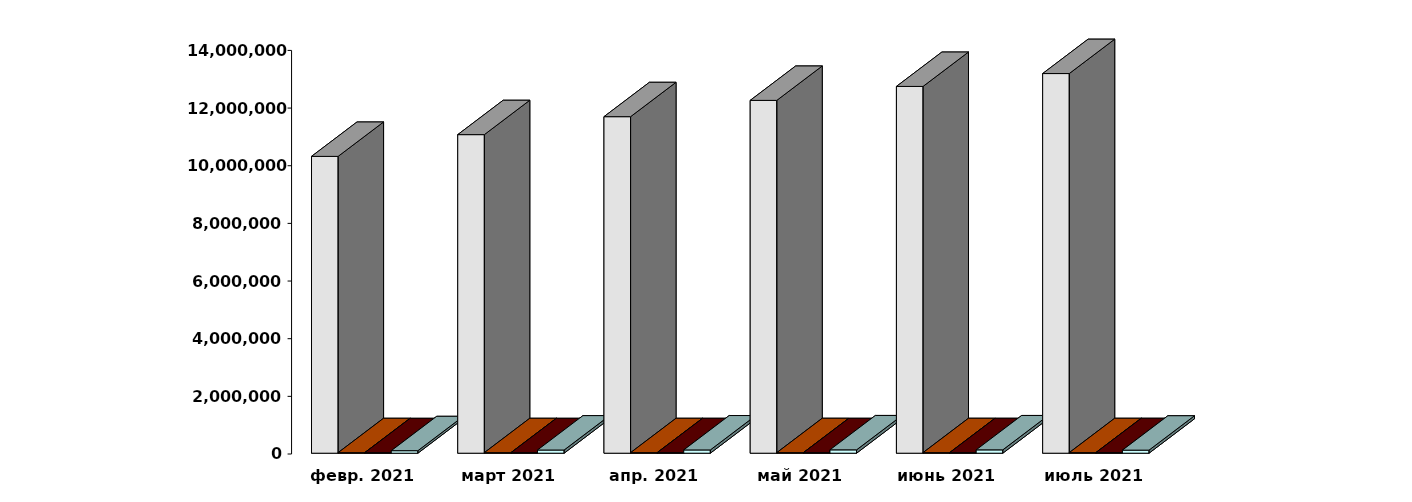
| Category | Физические лица | Юридические лица | Иностранные лица | Клиенты, передавшие свои средства в ДУ |
|---|---|---|---|---|
| 2021-02-28 | 10296032 | 19173 | 17445 | 86734 |
| 2021-03-30 | 11050505 | 19312 | 17990 | 110250 |
| 2021-04-30 | 11673527 | 19474 | 18437 | 113270 |
| 2021-05-30 | 12238639 | 19619 | 18804 | 116061 |
| 2021-06-30 | 12722884 | 19751 | 19280 | 115649 |
| 2021-07-31 | 13169586 | 19875 | 19720 | 105728 |